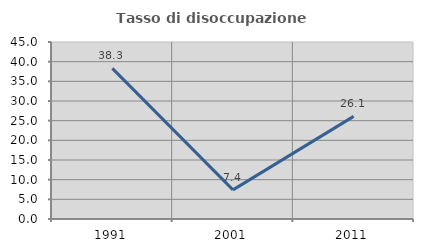
| Category | Tasso di disoccupazione giovanile  |
|---|---|
| 1991.0 | 38.298 |
| 2001.0 | 7.407 |
| 2011.0 | 26.087 |